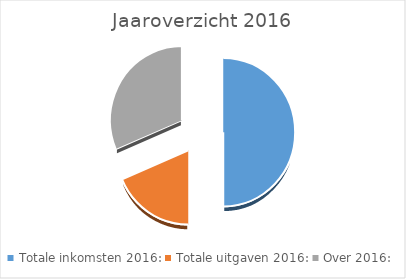
| Category | Series 0 |
|---|---|
| Totale inkomsten 2016: | 45936 |
| Totale uitgaven 2016: | 17106.25 |
| Over 2016: | 28829.75 |